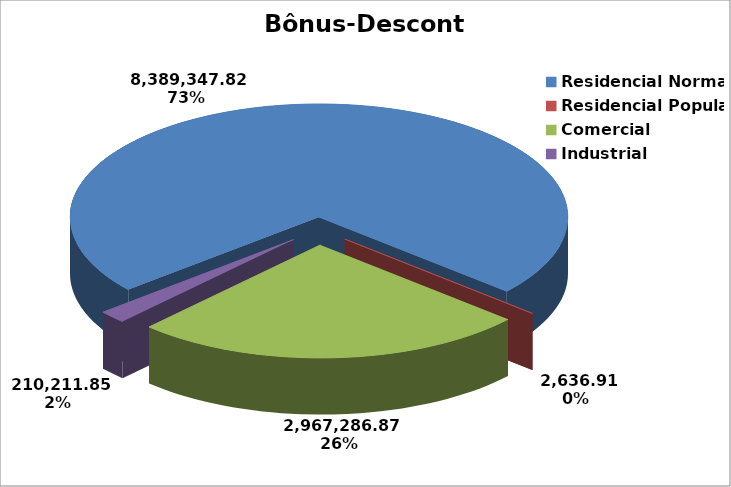
| Category | Bônus-Desconto |
|---|---|
| Residencial Normal | 8389347.824 |
| Residencial Popular | 2636.908 |
| Comercial | 2967286.872 |
| Industrial | 210211.848 |